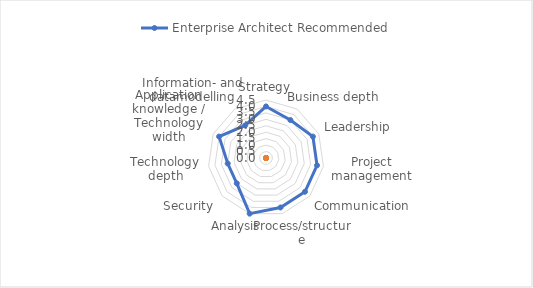
| Category | Enterprise Architect |
|---|---|
| Strategy |  |
| Business depth |  |
| Leadership |  |
| Project management |  |
| Communication |  |
| Process/structure |  |
| Analysis |  |
| Security |  |
| Technology depth |  |
| Application knowledge / Technology width |  |
| Information- and datamodelling |  |